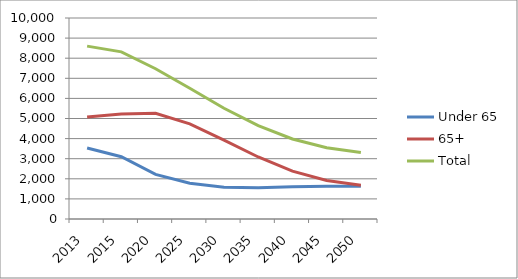
| Category | Under 65 | 65+ | Total |
|---|---|---|---|
| 2013.0 | 3530.634 | 5069.316 | 8599.95 |
| 2015.0 | 3095.487 | 5219.414 | 8314.901 |
| 2020.0 | 2218.242 | 5256.937 | 7475.179 |
| 2025.0 | 1777.559 | 4729.845 | 6507.404 |
| 2030.0 | 1585.273 | 3925.703 | 5510.976 |
| 2035.0 | 1558.431 | 3085.732 | 4644.163 |
| 2040.0 | 1603.744 | 2378.815 | 3982.56 |
| 2045.0 | 1629.747 | 1918.626 | 3548.373 |
| 2050.0 | 1624.392 | 1679.685 | 3304.077 |